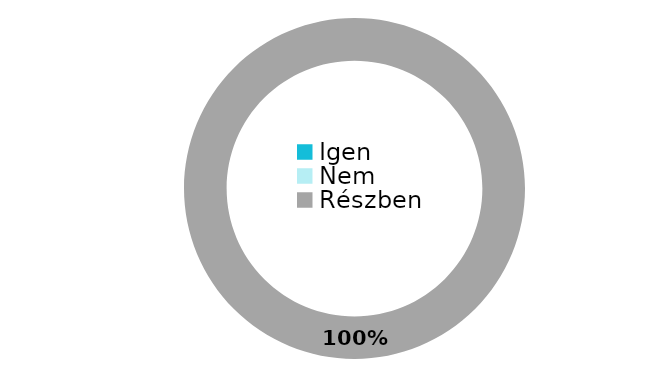
| Category | Series 0 |
|---|---|
| Igen | 0 |
| Nem | 0 |
| Részben | 54 |